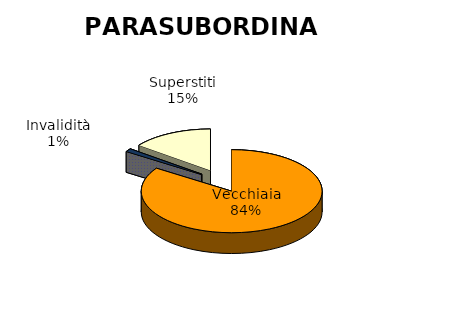
| Category | Parasubordinati |
|---|---|
| Vecchiaia | 6481 |
| Anz.tà/ Anticipate | 0 |
| Invalidità | 85 |
| Superstiti | 1117 |